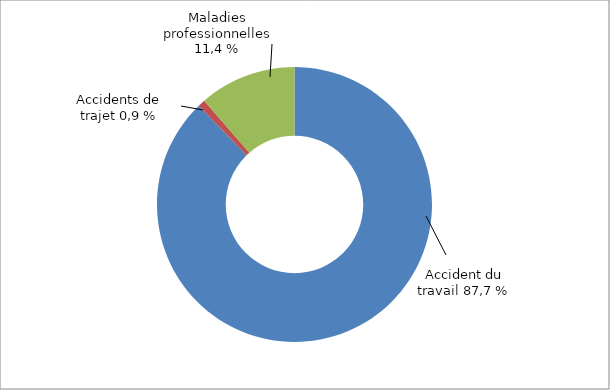
| Category | Series 0 |
|---|---|
| Accidents du travail | 14935 |
| Accidents de trajet | 148 |
| Maladies professionnelles | 1940 |